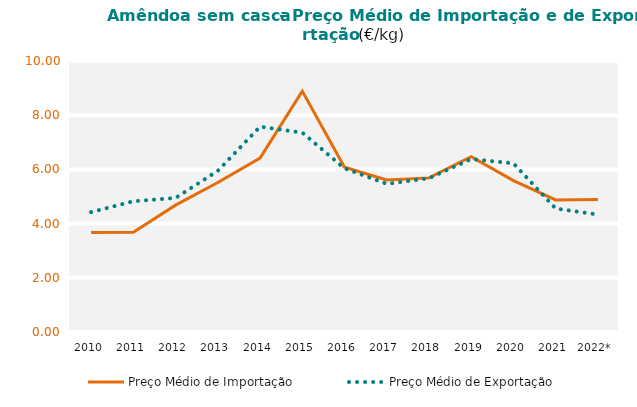
| Category | Preço Médio de Importação | Preço Médio de Exportação |
|---|---|---|
| 2010 | 3.668 | 4.424 |
| 2011 | 3.679 | 4.824 |
| 2012 | 4.681 | 4.947 |
| 2013 | 5.516 | 5.947 |
| 2014 | 6.418 | 7.577 |
| 2015 | 8.89 | 7.357 |
| 2016 | 6.079 | 6.038 |
| 2017 | 5.608 | 5.466 |
| 2018 | 5.687 | 5.674 |
| 2019 | 6.47 | 6.382 |
| 2020 | 5.588 | 6.223 |
| 2021 | 4.872 | 4.555 |
| 2022* | 4.887 | 4.334 |